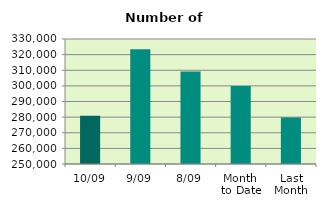
| Category | Series 0 |
|---|---|
| 10/09 | 280848 |
| 9/09 | 323434 |
| 8/09 | 309244 |
| Month 
to Date | 299888.5 |
| Last
Month | 279794.182 |